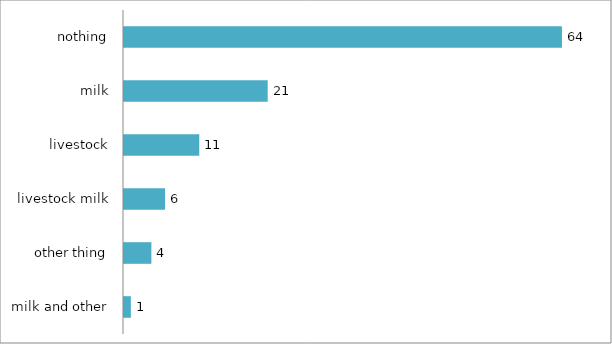
| Category | Series 0 |
|---|---|
| milk and other | 1 |
| other thing | 4 |
| livestock milk | 6 |
| livestock | 11 |
| milk | 21 |
| nothing | 64 |